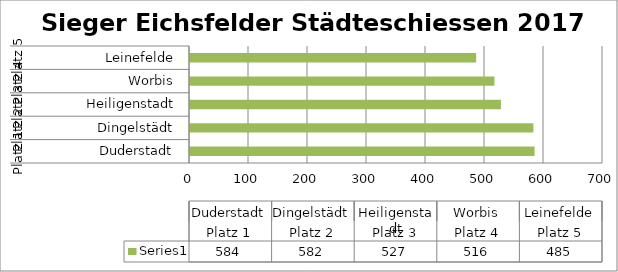
| Category | Series 0 |
|---|---|
| 0 | 584 |
| 1 | 582 |
| 2 | 527 |
| 3 | 516 |
| 4 | 485 |